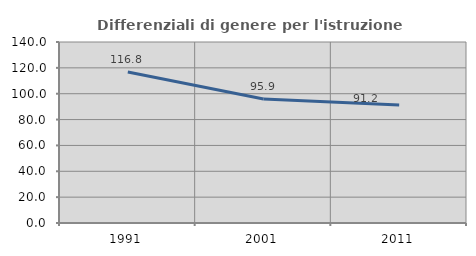
| Category | Differenziali di genere per l'istruzione superiore |
|---|---|
| 1991.0 | 116.825 |
| 2001.0 | 95.854 |
| 2011.0 | 91.217 |